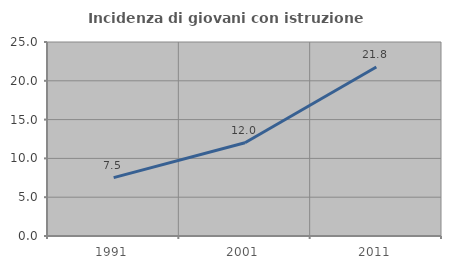
| Category | Incidenza di giovani con istruzione universitaria |
|---|---|
| 1991.0 | 7.519 |
| 2001.0 | 12.017 |
| 2011.0 | 21.769 |